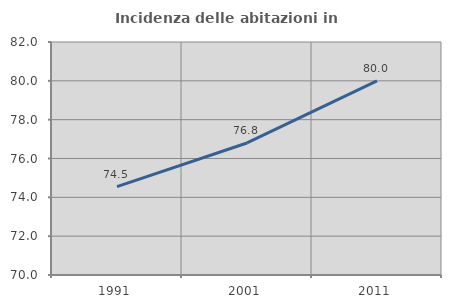
| Category | Incidenza delle abitazioni in proprietà  |
|---|---|
| 1991.0 | 74.548 |
| 2001.0 | 76.8 |
| 2011.0 | 80 |